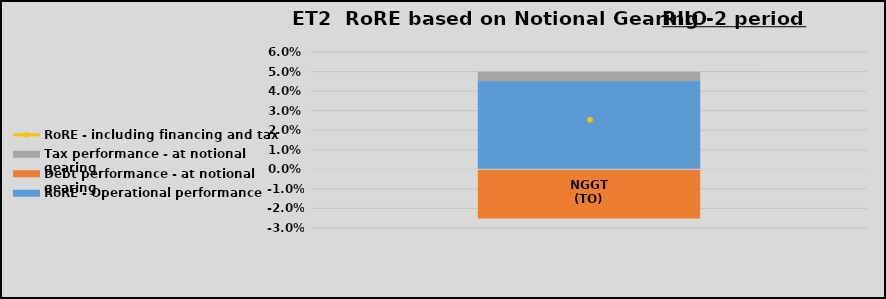
| Category | RoRE - Operational performance | Debt performance - at notional gearing | Tax performance - at notional gearing |
|---|---|---|---|
| NGGT (TO) | 0.046 | -0.025 | 0.004 |